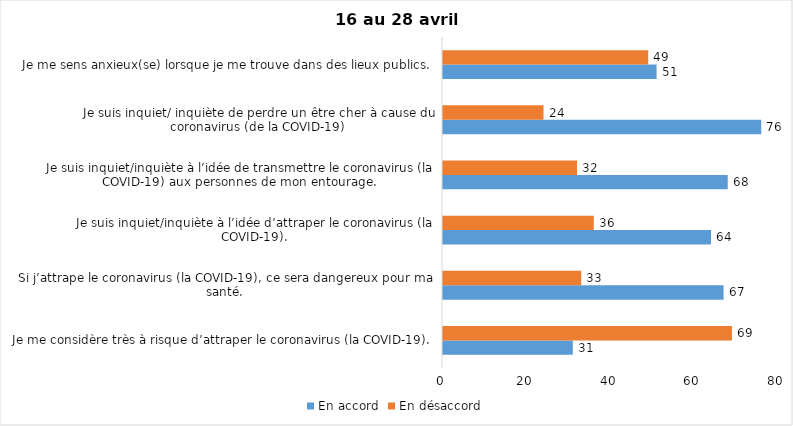
| Category | En accord | En désaccord |
|---|---|---|
| Je me considère très à risque d’attraper le coronavirus (la COVID-19). | 31 | 69 |
| Si j’attrape le coronavirus (la COVID-19), ce sera dangereux pour ma santé. | 67 | 33 |
| Je suis inquiet/inquiète à l’idée d’attraper le coronavirus (la COVID-19). | 64 | 36 |
| Je suis inquiet/inquiète à l’idée de transmettre le coronavirus (la COVID-19) aux personnes de mon entourage. | 68 | 32 |
| Je suis inquiet/ inquiète de perdre un être cher à cause du coronavirus (de la COVID-19) | 76 | 24 |
| Je me sens anxieux(se) lorsque je me trouve dans des lieux publics. | 51 | 49 |